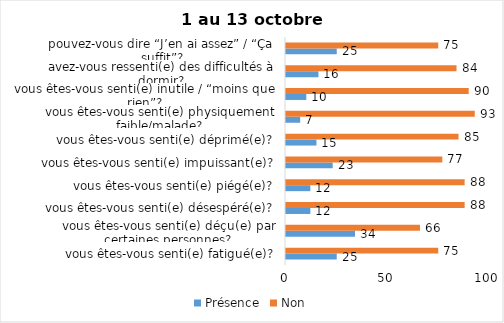
| Category | Présence | Non |
|---|---|---|
| vous êtes-vous senti(e) fatigué(e)? | 25 | 75 |
| vous êtes-vous senti(e) déçu(e) par certaines personnes? | 34 | 66 |
| vous êtes-vous senti(e) désespéré(e)? | 12 | 88 |
| vous êtes-vous senti(e) piégé(e)? | 12 | 88 |
| vous êtes-vous senti(e) impuissant(e)? | 23 | 77 |
| vous êtes-vous senti(e) déprimé(e)? | 15 | 85 |
| vous êtes-vous senti(e) physiquement faible/malade? | 7 | 93 |
| vous êtes-vous senti(e) inutile / “moins que rien”? | 10 | 90 |
| avez-vous ressenti(e) des difficultés à dormir? | 16 | 84 |
| pouvez-vous dire “J’en ai assez” / “Ça suffit”? | 25 | 75 |